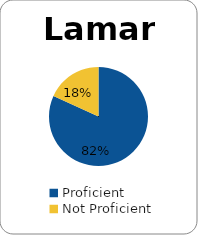
| Category | Series 0 |
|---|---|
| Proficient | 0.818 |
| Not Proficient | 0.182 |